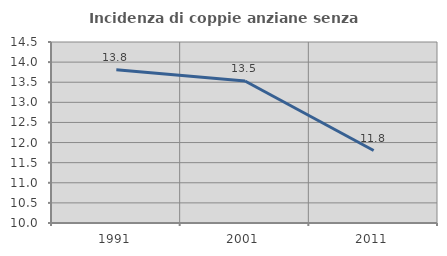
| Category | Incidenza di coppie anziane senza figli  |
|---|---|
| 1991.0 | 13.812 |
| 2001.0 | 13.529 |
| 2011.0 | 11.801 |